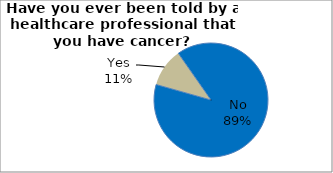
| Category | Series 0 |
|---|---|
| No | 89.092 |
| Yes | 10.908 |